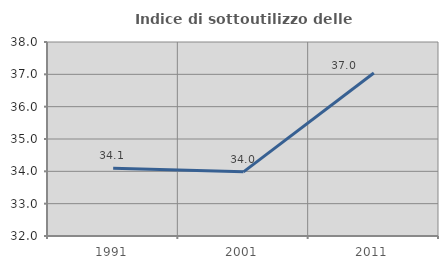
| Category | Indice di sottoutilizzo delle abitazioni  |
|---|---|
| 1991.0 | 34.096 |
| 2001.0 | 33.984 |
| 2011.0 | 37.042 |